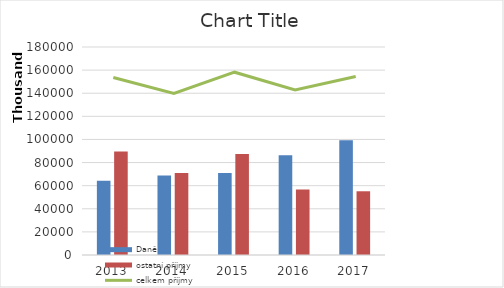
| Category | Daně | ostatní příjmy |
|---|---|---|
| 2013.0 | 64168276 | 89472981 |
| 2014.0 | 68876667 | 70930301 |
| 2015.0 | 70886189 | 87313297 |
| 2016.0 | 86223000 | 56664073.81 |
| 2017.0 | 99343846 | 55149703 |